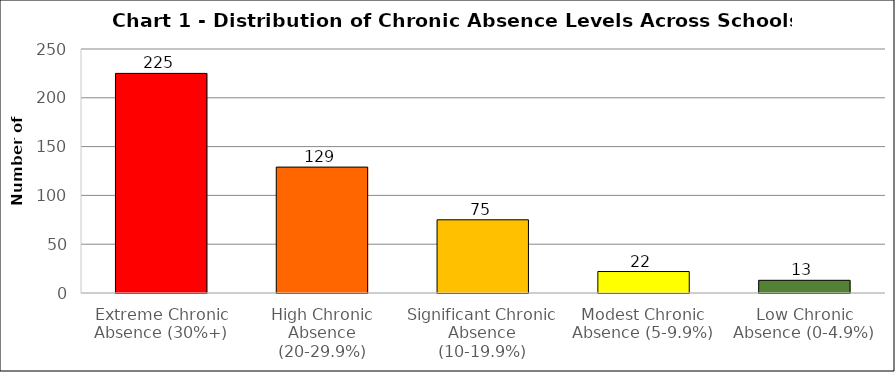
| Category | Series 0 |
|---|---|
| Extreme Chronic Absence (30%+) | 225 |
| High Chronic Absence (20-29.9%) | 129 |
| Significant Chronic Absence (10-19.9%) | 75 |
| Modest Chronic Absence (5-9.9%) | 22 |
| Low Chronic Absence (0-4.9%) | 13 |